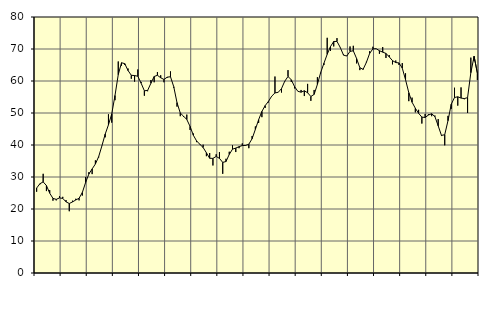
| Category | Piggar | Series 1 |
|---|---|---|
| nan | 25.4 | 26.55 |
| 87.0 | 27.7 | 27.89 |
| 87.0 | 31 | 28.47 |
| 87.0 | 25.6 | 27.33 |
| nan | 25.9 | 24.96 |
| 88.0 | 22.6 | 23.32 |
| 88.0 | 22.7 | 23.01 |
| 88.0 | 24 | 23.46 |
| nan | 23.8 | 23.32 |
| 89.0 | 22.8 | 22.25 |
| 89.0 | 19.3 | 21.71 |
| 89.0 | 22.6 | 22.22 |
| nan | 23.2 | 22.82 |
| 90.0 | 22.7 | 23.35 |
| 90.0 | 24.2 | 25.16 |
| 90.0 | 30 | 28.27 |
| nan | 31.5 | 30.92 |
| 91.0 | 30.9 | 32.52 |
| 91.0 | 35.2 | 34.06 |
| 91.0 | 36.1 | 36.36 |
| nan | 39.8 | 39.75 |
| 92.0 | 42.4 | 43.4 |
| 92.0 | 49.6 | 46.3 |
| 92.0 | 47 | 49.7 |
| nan | 54 | 55.46 |
| 93.0 | 66.1 | 61.99 |
| 93.0 | 64.8 | 65.7 |
| 93.0 | 65 | 65.42 |
| nan | 63.9 | 63.27 |
| 94.0 | 60.7 | 61.79 |
| 94.0 | 59.8 | 61.7 |
| 94.0 | 63.6 | 61.49 |
| nan | 59.7 | 59.33 |
| 95.0 | 55.4 | 56.95 |
| 95.0 | 56.8 | 57.05 |
| 95.0 | 60.3 | 59.3 |
| nan | 59.6 | 61.41 |
| 96.0 | 62.8 | 61.78 |
| 96.0 | 61.8 | 61.01 |
| 96.0 | 59.6 | 60.48 |
| nan | 61 | 61.2 |
| 97.0 | 63 | 61.33 |
| 97.0 | 57.9 | 58.2 |
| 97.0 | 52 | 53.24 |
| nan | 49 | 50 |
| 98.0 | 48.8 | 49 |
| 98.0 | 49.5 | 47.97 |
| 98.0 | 44.7 | 45.81 |
| nan | 43.6 | 43.05 |
| 99.0 | 40.9 | 41.26 |
| 99.0 | 40.1 | 40.22 |
| 99.0 | 40.1 | 39.21 |
| nan | 36.5 | 37.57 |
| 0.0 | 37.5 | 35.85 |
| 0.0 | 33.6 | 35.82 |
| 0.0 | 37.1 | 36.43 |
| nan | 37.8 | 35.82 |
| 1.0 | 31 | 34.57 |
| 1.0 | 35.7 | 34.83 |
| 1.0 | 37.9 | 37.06 |
| nan | 39.9 | 38.7 |
| 2.0 | 37.8 | 39.04 |
| 2.0 | 39 | 39.47 |
| 2.0 | 40.5 | 39.83 |
| nan | 40 | 39.86 |
| 3.0 | 39 | 40.25 |
| 3.0 | 42.8 | 41.96 |
| 3.0 | 45.8 | 44.88 |
| nan | 46.9 | 47.91 |
| 4.0 | 48.7 | 50.49 |
| 4.0 | 51.6 | 52.31 |
| 4.0 | 53.3 | 53.62 |
| nan | 55.3 | 55.26 |
| 5.0 | 61.4 | 56.27 |
| 5.0 | 56.5 | 56.47 |
| 5.0 | 56.4 | 57.62 |
| nan | 59.8 | 59.94 |
| 6.0 | 63.4 | 61.4 |
| 6.0 | 59.7 | 60.4 |
| 6.0 | 57.7 | 58.27 |
| nan | 56.8 | 56.79 |
| 7.0 | 57.2 | 56.5 |
| 7.0 | 55.3 | 56.95 |
| 7.0 | 59.1 | 56.33 |
| nan | 53.8 | 55.16 |
| 8.0 | 57.2 | 55.82 |
| 8.0 | 61.2 | 58.94 |
| 8.0 | 62.4 | 62.63 |
| nan | 65 | 65.54 |
| 9.0 | 73.5 | 68.34 |
| 9.0 | 69.4 | 70.74 |
| 9.0 | 70.8 | 72.35 |
| nan | 73.4 | 72.37 |
| 10.0 | 70.4 | 70.48 |
| 10.0 | 68.3 | 68.09 |
| 10.0 | 67.9 | 67.8 |
| nan | 70.8 | 69.26 |
| 11.0 | 71 | 69.44 |
| 11.0 | 65.5 | 67.04 |
| 11.0 | 63.4 | 64.16 |
| nan | 63.5 | 63.65 |
| 12.0 | 66 | 65.8 |
| 12.0 | 69.3 | 68.61 |
| 12.0 | 70.7 | 70.04 |
| nan | 70.1 | 70.1 |
| 13.0 | 68.5 | 69.46 |
| 13.0 | 70.6 | 69.02 |
| 13.0 | 67.2 | 68.62 |
| nan | 68.1 | 67.54 |
| 14.0 | 65.2 | 66.37 |
| 14.0 | 66.4 | 65.77 |
| 14.0 | 65 | 65.64 |
| nan | 65.6 | 64.02 |
| 15.0 | 62.4 | 60.41 |
| 15.0 | 53.7 | 56.34 |
| 15.0 | 54.8 | 53.36 |
| nan | 50.2 | 51.49 |
| 16.0 | 51 | 49.9 |
| 16.0 | 46.7 | 48.72 |
| 16.0 | 49.7 | 48.6 |
| nan | 49.6 | 49.36 |
| 17.0 | 49 | 49.77 |
| 17.0 | 49.2 | 48.86 |
| 17.0 | 48.1 | 45.99 |
| nan | 42.8 | 42.99 |
| 18.0 | 39.9 | 43.22 |
| 18.0 | 49.1 | 47.6 |
| 18.0 | 51.3 | 52.74 |
| nan | 57.9 | 54.84 |
| 19.0 | 52.3 | 55.07 |
| 19.0 | 58 | 54.66 |
| 19.0 | 54.3 | 54.51 |
| nan | 50 | 54.8 |
| 20.0 | 67.3 | 62.59 |
| 20.0 | 66.2 | 67.71 |
| 20.0 | 60.3 | 62.46 |